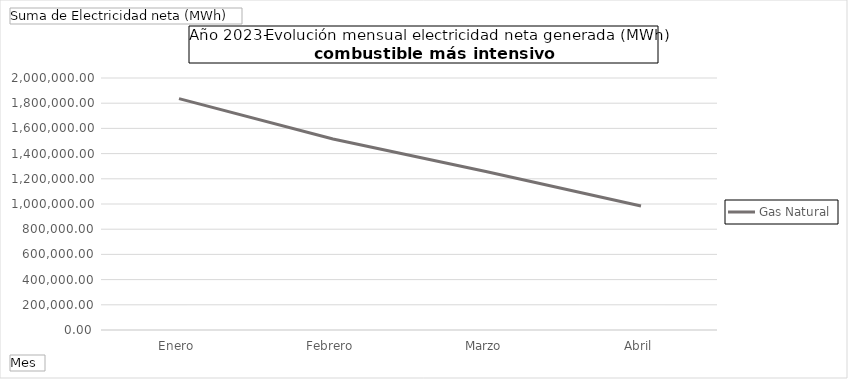
| Category | Gas Natural |
|---|---|
| Enero | 1836661.42 |
| Febrero | 1515724.14 |
| Marzo | 1255435.403 |
| Abril | 984153.06 |